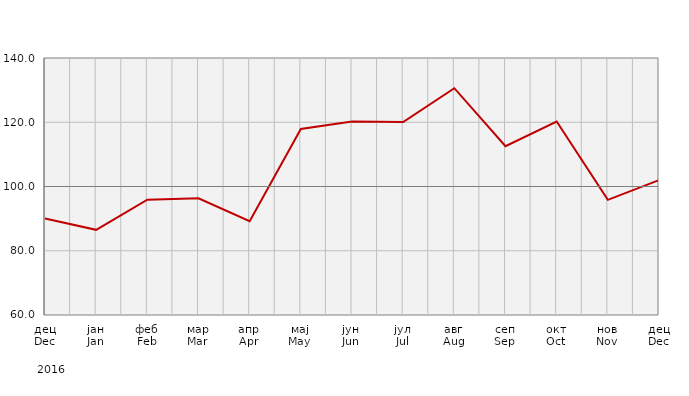
| Category | Индекси ноћења туриста
Tourist night indices |
|---|---|
| дец
Dec | 90.034 |
| јан
Jan | 86.514 |
| феб
Feb | 95.907 |
| мар
Mar | 96.311 |
| апр
Apr | 89.193 |
| мај
May | 117.906 |
| јун
Jun | 120.259 |
| јул
Jul | 120.08 |
| авг
Aug | 130.596 |
| сеп
Sep | 112.544 |
| окт
Oct | 120.238 |
| нов
Nov | 95.857 |
| дец
Dec | 101.993 |